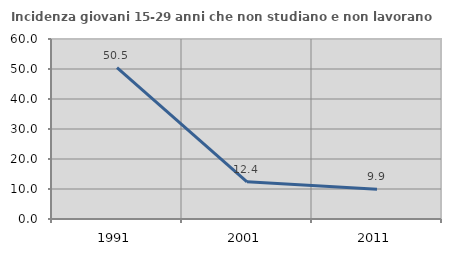
| Category | Incidenza giovani 15-29 anni che non studiano e non lavorano  |
|---|---|
| 1991.0 | 50.478 |
| 2001.0 | 12.384 |
| 2011.0 | 9.921 |